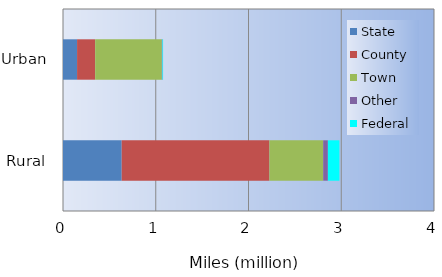
| Category | State | County | Town | Other | Federal |
|---|---|---|---|---|---|
| Rural | 0.633 | 1.593 | 0.58 | 0.05 | 0.124 |
| Urban | 0.152 | 0.195 | 0.719 | 0.007 | 0.007 |